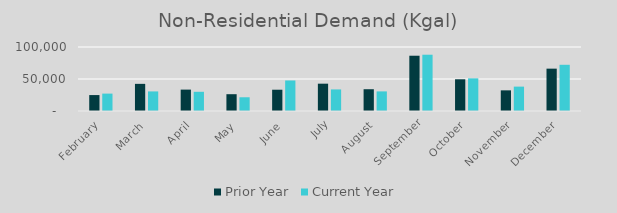
| Category | Prior Year | Current Year |
|---|---|---|
| February | 24891.705 | 27184.287 |
| March | 42416.796 | 30591.784 |
| April | 33427.881 | 30008.586 |
| May | 26254.448 | 21459.484 |
| June | 33248.873 | 47687.401 |
| July | 42679.938 | 33702.696 |
| August | 34036.498 | 30630.765 |
| September | 86367.775 | 87939.966 |
| October | 49561.754 | 51017.647 |
| November | 32261.42 | 38090.247 |
| December | 66164.871 | 72201.815 |